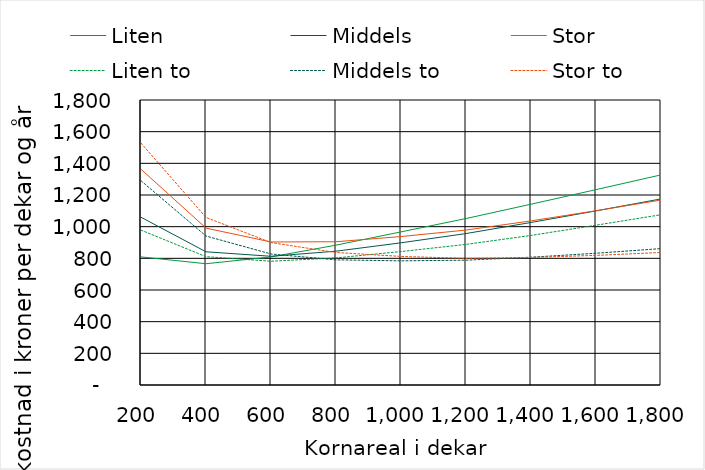
| Category | Liten | Middels | Stor | Liten to | Middels to | Stor to |
|---|---|---|---|---|---|---|
| 200.0 | 809.029 | 1059.546 | 1362.45 | 978.28 | 1290.014 | 1527.836 |
| 400.0 | 765.956 | 841.357 | 991.048 | 810.546 | 940.97 | 1058.262 |
| 600.0 | 808.862 | 812.985 | 903.259 | 781.648 | 827.359 | 899.475 |
| 800.0 | 883.241 | 845.113 | 904.831 | 802.662 | 790.413 | 836.805 |
| 1000.0 | 967.078 | 898.078 | 937.694 | 842.742 | 784.176 | 812.053 |
| 1200.0 | 1051.337 | 956.543 | 978.461 | 887.943 | 788.299 | 799.898 |
| 1400.0 | 1141.827 | 1026.457 | 1036.498 | 944.574 | 807.116 | 805.514 |
| 1600.0 | 1233.869 | 1099.731 | 1100.657 | 1009.279 | 832.171 | 818.664 |
| 1800.0 | 1326.92 | 1175.237 | 1168.136 | 1075.281 | 861.467 | 836.925 |